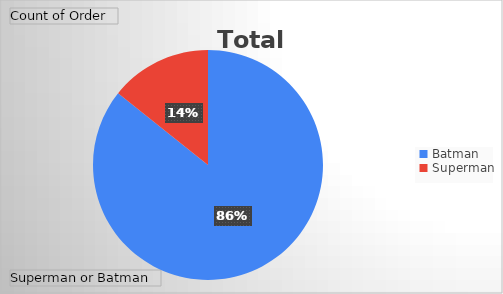
| Category | Total |
|---|---|
| Batman | 18 |
| Superman | 3 |